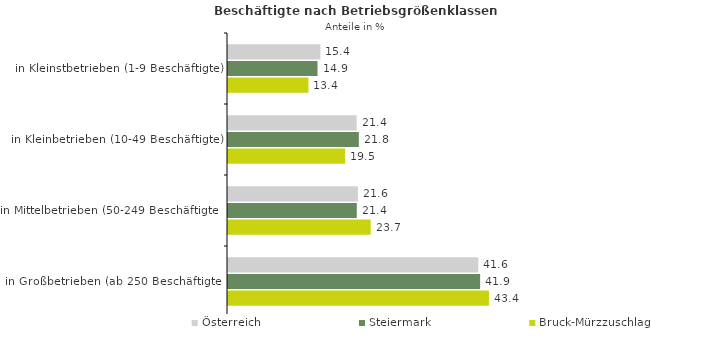
| Category | Österreich | Steiermark | Bruck-Mürzzuschlag |
|---|---|---|---|
| in Kleinstbetrieben (1-9 Beschäftigte) | 15.366 | 14.89 | 13.385 |
| in Kleinbetrieben (10-49 Beschäftigte) | 21.402 | 21.759 | 19.484 |
| in Mittelbetrieben (50-249 Beschäftigte) | 21.603 | 21.42 | 23.73 |
| in Großbetrieben (ab 250 Beschäftigte) | 41.629 | 41.932 | 43.4 |